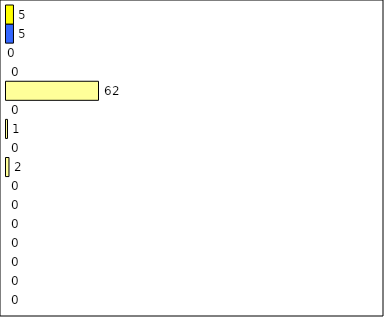
| Category | -2 | -1 | 0 | 1 | 2 | 3 | 4 | 5 | 6 | 7 | 8 | 9 | 10 | 11 | 12 | Perfect Round |
|---|---|---|---|---|---|---|---|---|---|---|---|---|---|---|---|---|
| 0 | 0 | 0 | 0 | 0 | 0 | 0 | 0 | 2 | 0 | 1 | 0 | 62 | 0 | 0 | 5 | 5 |